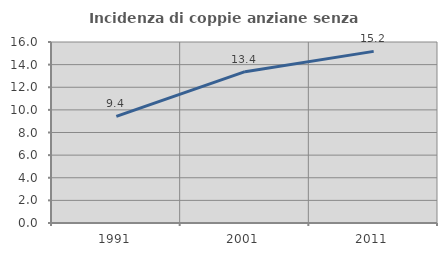
| Category | Incidenza di coppie anziane senza figli  |
|---|---|
| 1991.0 | 9.431 |
| 2001.0 | 13.376 |
| 2011.0 | 15.171 |